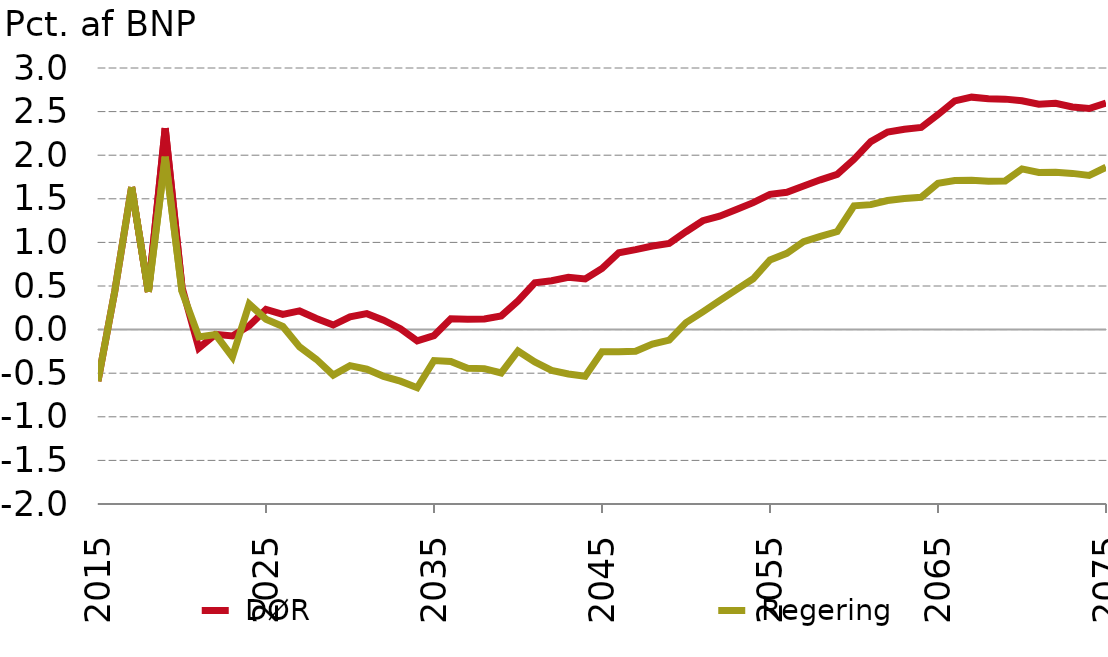
| Category | nullinje |  DØR |  Regering |
|---|---|---|---|
| 2015-01-01 | 0 | -0.592 | -0.592 |
| 2016-01-01 | 0 | 0.442 | 0.442 |
| 2017-01-01 | 0 | 1.635 | 1.635 |
| 2018-01-01 | 0 | 0.432 | 0.432 |
| 2019-01-01 | 0 | 2.311 | 1.982 |
| 2020-01-01 | 0 | 0.487 | 0.437 |
| 2021-01-01 | 0 | -0.212 | -0.084 |
| 2022-01-01 | 0 | -0.055 | -0.057 |
| 2023-01-01 | 0 | -0.072 | -0.313 |
| 2024-01-01 | 0 | 0.044 | 0.293 |
| 2025-01-01 | 0 | 0.232 | 0.12 |
| 2026-01-01 | 0 | 0.174 | 0.036 |
| 2027-01-01 | 0 | 0.214 | -0.199 |
| 2028-01-01 | 0 | 0.128 | -0.341 |
| 2029-01-01 | 0 | 0.052 | -0.522 |
| 2030-01-01 | 0 | 0.147 | -0.413 |
| 2031-01-01 | 0 | 0.183 | -0.454 |
| 2032-01-01 | 0 | 0.108 | -0.536 |
| 2033-01-01 | 0 | 0.01 | -0.592 |
| 2034-01-01 | 0 | -0.128 | -0.667 |
| 2035-01-01 | 0 | -0.068 | -0.354 |
| 2036-01-01 | 0 | 0.124 | -0.365 |
| 2037-01-01 | 0 | 0.117 | -0.443 |
| 2038-01-01 | 0 | 0.122 | -0.447 |
| 2039-01-01 | 0 | 0.157 | -0.497 |
| 2040-01-01 | 0 | 0.329 | -0.245 |
| 2041-01-01 | 0 | 0.536 | -0.371 |
| 2042-01-01 | 0 | 0.56 | -0.468 |
| 2043-01-01 | 0 | 0.6 | -0.509 |
| 2044-01-01 | 0 | 0.581 | -0.534 |
| 2045-01-01 | 0 | 0.701 | -0.255 |
| 2046-01-01 | 0 | 0.881 | -0.255 |
| 2047-01-01 | 0 | 0.917 | -0.248 |
| 2048-01-01 | 0 | 0.958 | -0.165 |
| 2049-01-01 | 0 | 0.989 | -0.121 |
| 2050-01-01 | 0 | 1.123 | 0.08 |
| 2051-01-01 | 0 | 1.249 | 0.204 |
| 2052-01-01 | 0 | 1.3 | 0.332 |
| 2053-01-01 | 0 | 1.378 | 0.458 |
| 2054-01-01 | 0 | 1.456 | 0.582 |
| 2055-01-01 | 0 | 1.552 | 0.799 |
| 2056-01-01 | 0 | 1.576 | 0.875 |
| 2057-01-01 | 0 | 1.648 | 1.008 |
| 2058-01-01 | 0 | 1.718 | 1.068 |
| 2059-01-01 | 0 | 1.78 | 1.124 |
| 2060-01-01 | 0 | 1.953 | 1.42 |
| 2061-01-01 | 0 | 2.156 | 1.433 |
| 2062-01-01 | 0 | 2.266 | 1.481 |
| 2063-01-01 | 0 | 2.297 | 1.504 |
| 2064-01-01 | 0 | 2.319 | 1.518 |
| 2065-01-01 | 0 | 2.465 | 1.679 |
| 2066-01-01 | 0 | 2.623 | 1.709 |
| 2067-01-01 | 0 | 2.666 | 1.712 |
| 2068-01-01 | 0 | 2.648 | 1.702 |
| 2069-01-01 | 0 | 2.643 | 1.705 |
| 2070-01-01 | 0 | 2.625 | 1.843 |
| 2071-01-01 | 0 | 2.584 | 1.803 |
| 2072-01-01 | 0 | 2.595 | 1.805 |
| 2073-01-01 | 0 | 2.553 | 1.791 |
| 2074-01-01 | 0 | 2.535 | 1.768 |
| 2075-01-01 | 0 | 2.597 | 1.862 |